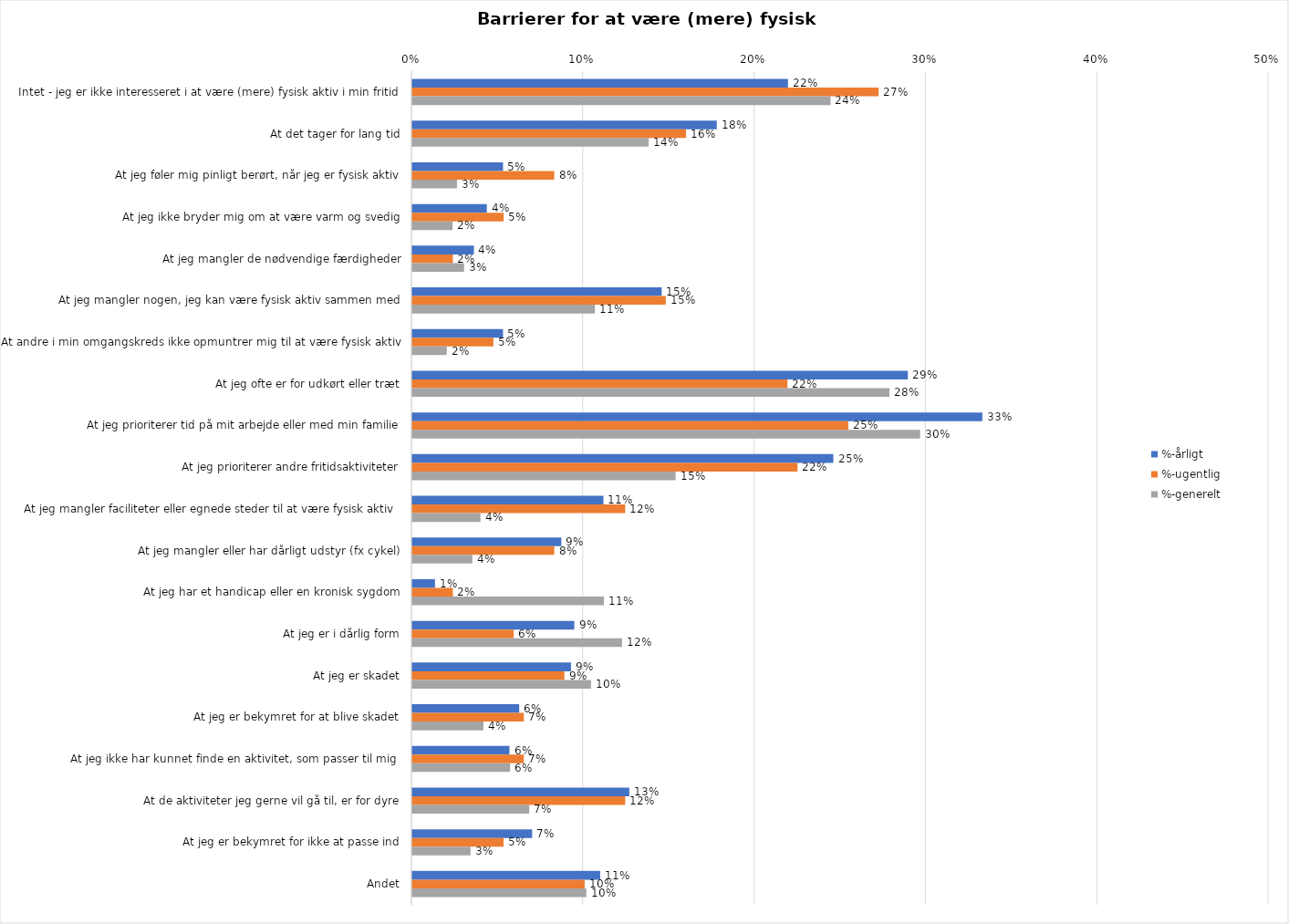
| Category | %-årligt | %-ugentlig | %-generelt |
|---|---|---|---|
| Intet - jeg er ikke interesseret i at være (mere) fysisk aktiv i min fritid | 0.219 | 0.272 | 0.244 |
| At det tager for lang tid | 0.178 | 0.16 | 0.138 |
| At jeg føler mig pinligt berørt, når jeg er fysisk aktiv | 0.053 | 0.083 | 0.026 |
| At jeg ikke bryder mig om at være varm og svedig | 0.043 | 0.053 | 0.023 |
| At jeg mangler de nødvendige færdigheder | 0.036 | 0.024 | 0.03 |
| At jeg mangler nogen, jeg kan være fysisk aktiv sammen med | 0.146 | 0.148 | 0.107 |
| At andre i min omgangskreds ikke opmuntrer mig til at være fysisk aktiv | 0.053 | 0.047 | 0.02 |
| At jeg ofte er for udkørt eller træt | 0.289 | 0.219 | 0.279 |
| At jeg prioriterer tid på mit arbejde eller med min familie | 0.333 | 0.254 | 0.296 |
| At jeg prioriterer andre fritidsaktiviteter | 0.246 | 0.225 | 0.154 |
| At jeg mangler faciliteter eller egnede steder til at være fysisk aktiv  | 0.112 | 0.124 | 0.04 |
| At jeg mangler eller har dårligt udstyr (fx cykel) | 0.087 | 0.083 | 0.035 |
| At jeg har et handicap eller en kronisk sygdom | 0.013 | 0.024 | 0.112 |
| At jeg er i dårlig form | 0.095 | 0.059 | 0.122 |
| At jeg er skadet | 0.093 | 0.089 | 0.104 |
| At jeg er bekymret for at blive skadet | 0.062 | 0.065 | 0.041 |
| At jeg ikke har kunnet finde en aktivitet, som passer til mig  | 0.057 | 0.065 | 0.057 |
| At de aktiviteter jeg gerne vil gå til, er for dyre | 0.127 | 0.124 | 0.068 |
| At jeg er bekymret for ikke at passe ind | 0.07 | 0.053 | 0.034 |
| Andet | 0.11 | 0.101 | 0.102 |